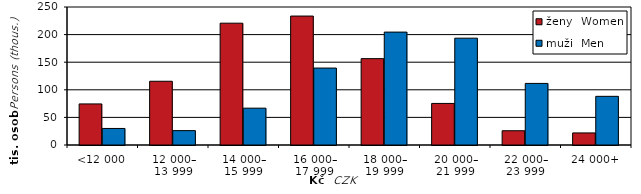
| Category | ženy  Women | muži  Men |
|---|---|---|
| <12 000 | 74434 | 29965 |
| 12 000–
13 999 | 115462 | 26051 |
| 14 000–
15 999 | 220683 | 66721 |
| 16 000–
17 999 | 233585 | 139399 |
| 18 000–
19 999 | 156468 | 204522 |
| 20 000–
21 999 | 75306 | 193514 |
| 22 000–
23 999 | 25842 | 111580 |
| 24 000+ | 21863 | 88157 |